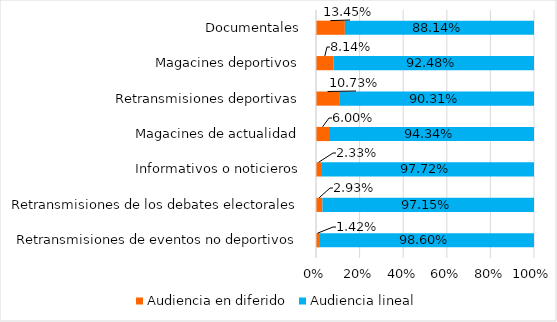
| Category | Audiencia en diferido | Audiencia lineal |
|---|---|---|
| Retransmisiones de eventos no deportivos | 0.014 | 0.986 |
| Retransmisiones de los debates electorales | 0.029 | 0.972 |
| Informativos o noticieros | 0.023 | 0.977 |
| Magacines de actualidad | 0.06 | 0.943 |
| Retransmisiones deportivas | 0.107 | 0.903 |
| Magacines deportivos | 0.081 | 0.925 |
| Documentales | 0.135 | 0.881 |